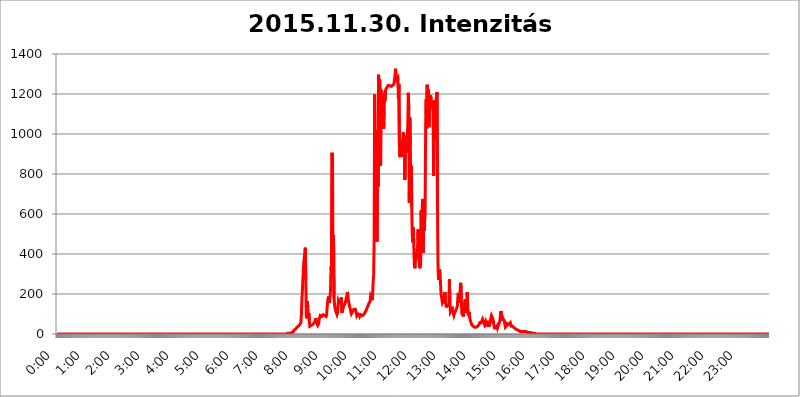
| Category | 2015.11.30. Intenzitás [W/m^2] |
|---|---|
| 0.0 | 0 |
| 0.0006944444444444445 | 0 |
| 0.001388888888888889 | 0 |
| 0.0020833333333333333 | 0 |
| 0.002777777777777778 | 0 |
| 0.003472222222222222 | 0 |
| 0.004166666666666667 | 0 |
| 0.004861111111111111 | 0 |
| 0.005555555555555556 | 0 |
| 0.0062499999999999995 | 0 |
| 0.006944444444444444 | 0 |
| 0.007638888888888889 | 0 |
| 0.008333333333333333 | 0 |
| 0.009027777777777779 | 0 |
| 0.009722222222222222 | 0 |
| 0.010416666666666666 | 0 |
| 0.011111111111111112 | 0 |
| 0.011805555555555555 | 0 |
| 0.012499999999999999 | 0 |
| 0.013194444444444444 | 0 |
| 0.013888888888888888 | 0 |
| 0.014583333333333332 | 0 |
| 0.015277777777777777 | 0 |
| 0.015972222222222224 | 0 |
| 0.016666666666666666 | 0 |
| 0.017361111111111112 | 0 |
| 0.018055555555555557 | 0 |
| 0.01875 | 0 |
| 0.019444444444444445 | 0 |
| 0.02013888888888889 | 0 |
| 0.020833333333333332 | 0 |
| 0.02152777777777778 | 0 |
| 0.022222222222222223 | 0 |
| 0.02291666666666667 | 0 |
| 0.02361111111111111 | 0 |
| 0.024305555555555556 | 0 |
| 0.024999999999999998 | 0 |
| 0.025694444444444447 | 0 |
| 0.02638888888888889 | 0 |
| 0.027083333333333334 | 0 |
| 0.027777777777777776 | 0 |
| 0.02847222222222222 | 0 |
| 0.029166666666666664 | 0 |
| 0.029861111111111113 | 0 |
| 0.030555555555555555 | 0 |
| 0.03125 | 0 |
| 0.03194444444444445 | 0 |
| 0.03263888888888889 | 0 |
| 0.03333333333333333 | 0 |
| 0.034027777777777775 | 0 |
| 0.034722222222222224 | 0 |
| 0.035416666666666666 | 0 |
| 0.036111111111111115 | 0 |
| 0.03680555555555556 | 0 |
| 0.0375 | 0 |
| 0.03819444444444444 | 0 |
| 0.03888888888888889 | 0 |
| 0.03958333333333333 | 0 |
| 0.04027777777777778 | 0 |
| 0.04097222222222222 | 0 |
| 0.041666666666666664 | 0 |
| 0.042361111111111106 | 0 |
| 0.04305555555555556 | 0 |
| 0.043750000000000004 | 0 |
| 0.044444444444444446 | 0 |
| 0.04513888888888889 | 0 |
| 0.04583333333333334 | 0 |
| 0.04652777777777778 | 0 |
| 0.04722222222222222 | 0 |
| 0.04791666666666666 | 0 |
| 0.04861111111111111 | 0 |
| 0.049305555555555554 | 0 |
| 0.049999999999999996 | 0 |
| 0.05069444444444445 | 0 |
| 0.051388888888888894 | 0 |
| 0.052083333333333336 | 0 |
| 0.05277777777777778 | 0 |
| 0.05347222222222222 | 0 |
| 0.05416666666666667 | 0 |
| 0.05486111111111111 | 0 |
| 0.05555555555555555 | 0 |
| 0.05625 | 0 |
| 0.05694444444444444 | 0 |
| 0.057638888888888885 | 0 |
| 0.05833333333333333 | 0 |
| 0.05902777777777778 | 0 |
| 0.059722222222222225 | 0 |
| 0.06041666666666667 | 0 |
| 0.061111111111111116 | 0 |
| 0.06180555555555556 | 0 |
| 0.0625 | 0 |
| 0.06319444444444444 | 0 |
| 0.06388888888888888 | 0 |
| 0.06458333333333334 | 0 |
| 0.06527777777777778 | 0 |
| 0.06597222222222222 | 0 |
| 0.06666666666666667 | 0 |
| 0.06736111111111111 | 0 |
| 0.06805555555555555 | 0 |
| 0.06874999999999999 | 0 |
| 0.06944444444444443 | 0 |
| 0.07013888888888889 | 0 |
| 0.07083333333333333 | 0 |
| 0.07152777777777779 | 0 |
| 0.07222222222222223 | 0 |
| 0.07291666666666667 | 0 |
| 0.07361111111111111 | 0 |
| 0.07430555555555556 | 0 |
| 0.075 | 0 |
| 0.07569444444444444 | 0 |
| 0.0763888888888889 | 0 |
| 0.07708333333333334 | 0 |
| 0.07777777777777778 | 0 |
| 0.07847222222222222 | 0 |
| 0.07916666666666666 | 0 |
| 0.0798611111111111 | 0 |
| 0.08055555555555556 | 0 |
| 0.08125 | 0 |
| 0.08194444444444444 | 0 |
| 0.08263888888888889 | 0 |
| 0.08333333333333333 | 0 |
| 0.08402777777777777 | 0 |
| 0.08472222222222221 | 0 |
| 0.08541666666666665 | 0 |
| 0.08611111111111112 | 0 |
| 0.08680555555555557 | 0 |
| 0.08750000000000001 | 0 |
| 0.08819444444444445 | 0 |
| 0.08888888888888889 | 0 |
| 0.08958333333333333 | 0 |
| 0.09027777777777778 | 0 |
| 0.09097222222222222 | 0 |
| 0.09166666666666667 | 0 |
| 0.09236111111111112 | 0 |
| 0.09305555555555556 | 0 |
| 0.09375 | 0 |
| 0.09444444444444444 | 0 |
| 0.09513888888888888 | 0 |
| 0.09583333333333333 | 0 |
| 0.09652777777777777 | 0 |
| 0.09722222222222222 | 0 |
| 0.09791666666666667 | 0 |
| 0.09861111111111111 | 0 |
| 0.09930555555555555 | 0 |
| 0.09999999999999999 | 0 |
| 0.10069444444444443 | 0 |
| 0.1013888888888889 | 0 |
| 0.10208333333333335 | 0 |
| 0.10277777777777779 | 0 |
| 0.10347222222222223 | 0 |
| 0.10416666666666667 | 0 |
| 0.10486111111111111 | 0 |
| 0.10555555555555556 | 0 |
| 0.10625 | 0 |
| 0.10694444444444444 | 0 |
| 0.1076388888888889 | 0 |
| 0.10833333333333334 | 0 |
| 0.10902777777777778 | 0 |
| 0.10972222222222222 | 0 |
| 0.1111111111111111 | 0 |
| 0.11180555555555556 | 0 |
| 0.11180555555555556 | 0 |
| 0.1125 | 0 |
| 0.11319444444444444 | 0 |
| 0.11388888888888889 | 0 |
| 0.11458333333333333 | 0 |
| 0.11527777777777777 | 0 |
| 0.11597222222222221 | 0 |
| 0.11666666666666665 | 0 |
| 0.1173611111111111 | 0 |
| 0.11805555555555557 | 0 |
| 0.11944444444444445 | 0 |
| 0.12013888888888889 | 0 |
| 0.12083333333333333 | 0 |
| 0.12152777777777778 | 0 |
| 0.12222222222222223 | 0 |
| 0.12291666666666667 | 0 |
| 0.12291666666666667 | 0 |
| 0.12361111111111112 | 0 |
| 0.12430555555555556 | 0 |
| 0.125 | 0 |
| 0.12569444444444444 | 0 |
| 0.12638888888888888 | 0 |
| 0.12708333333333333 | 0 |
| 0.16875 | 0 |
| 0.12847222222222224 | 0 |
| 0.12916666666666668 | 0 |
| 0.12986111111111112 | 0 |
| 0.13055555555555556 | 0 |
| 0.13125 | 0 |
| 0.13194444444444445 | 0 |
| 0.1326388888888889 | 0 |
| 0.13333333333333333 | 0 |
| 0.13402777777777777 | 0 |
| 0.13402777777777777 | 0 |
| 0.13472222222222222 | 0 |
| 0.13541666666666666 | 0 |
| 0.1361111111111111 | 0 |
| 0.13749999999999998 | 0 |
| 0.13819444444444443 | 0 |
| 0.1388888888888889 | 0 |
| 0.13958333333333334 | 0 |
| 0.14027777777777778 | 0 |
| 0.14097222222222222 | 0 |
| 0.14166666666666666 | 0 |
| 0.1423611111111111 | 0 |
| 0.14305555555555557 | 0 |
| 0.14375000000000002 | 0 |
| 0.14444444444444446 | 0 |
| 0.1451388888888889 | 0 |
| 0.1451388888888889 | 0 |
| 0.14652777777777778 | 0 |
| 0.14722222222222223 | 0 |
| 0.14791666666666667 | 0 |
| 0.1486111111111111 | 0 |
| 0.14930555555555555 | 0 |
| 0.15 | 0 |
| 0.15069444444444444 | 0 |
| 0.15138888888888888 | 0 |
| 0.15208333333333332 | 0 |
| 0.15277777777777776 | 0 |
| 0.15347222222222223 | 0 |
| 0.15416666666666667 | 0 |
| 0.15486111111111112 | 0 |
| 0.15555555555555556 | 0 |
| 0.15625 | 0 |
| 0.15694444444444444 | 0 |
| 0.15763888888888888 | 0 |
| 0.15833333333333333 | 0 |
| 0.15902777777777777 | 0 |
| 0.15972222222222224 | 0 |
| 0.16041666666666668 | 0 |
| 0.16111111111111112 | 0 |
| 0.16180555555555556 | 0 |
| 0.1625 | 0 |
| 0.16319444444444445 | 0 |
| 0.1638888888888889 | 0 |
| 0.16458333333333333 | 0 |
| 0.16527777777777777 | 0 |
| 0.16597222222222222 | 0 |
| 0.16666666666666666 | 0 |
| 0.1673611111111111 | 0 |
| 0.16805555555555554 | 0 |
| 0.16874999999999998 | 0 |
| 0.16944444444444443 | 0 |
| 0.17013888888888887 | 0 |
| 0.1708333333333333 | 0 |
| 0.17152777777777775 | 0 |
| 0.17222222222222225 | 0 |
| 0.1729166666666667 | 0 |
| 0.17361111111111113 | 0 |
| 0.17430555555555557 | 0 |
| 0.17500000000000002 | 0 |
| 0.17569444444444446 | 0 |
| 0.1763888888888889 | 0 |
| 0.17708333333333334 | 0 |
| 0.17777777777777778 | 0 |
| 0.17847222222222223 | 0 |
| 0.17916666666666667 | 0 |
| 0.1798611111111111 | 0 |
| 0.18055555555555555 | 0 |
| 0.18125 | 0 |
| 0.18194444444444444 | 0 |
| 0.1826388888888889 | 0 |
| 0.18333333333333335 | 0 |
| 0.1840277777777778 | 0 |
| 0.18472222222222223 | 0 |
| 0.18541666666666667 | 0 |
| 0.18611111111111112 | 0 |
| 0.18680555555555556 | 0 |
| 0.1875 | 0 |
| 0.18819444444444444 | 0 |
| 0.18888888888888888 | 0 |
| 0.18958333333333333 | 0 |
| 0.19027777777777777 | 0 |
| 0.1909722222222222 | 0 |
| 0.19166666666666665 | 0 |
| 0.19236111111111112 | 0 |
| 0.19305555555555554 | 0 |
| 0.19375 | 0 |
| 0.19444444444444445 | 0 |
| 0.1951388888888889 | 0 |
| 0.19583333333333333 | 0 |
| 0.19652777777777777 | 0 |
| 0.19722222222222222 | 0 |
| 0.19791666666666666 | 0 |
| 0.1986111111111111 | 0 |
| 0.19930555555555554 | 0 |
| 0.19999999999999998 | 0 |
| 0.20069444444444443 | 0 |
| 0.20138888888888887 | 0 |
| 0.2020833333333333 | 0 |
| 0.2027777777777778 | 0 |
| 0.2034722222222222 | 0 |
| 0.2041666666666667 | 0 |
| 0.20486111111111113 | 0 |
| 0.20555555555555557 | 0 |
| 0.20625000000000002 | 0 |
| 0.20694444444444446 | 0 |
| 0.2076388888888889 | 0 |
| 0.20833333333333334 | 0 |
| 0.20902777777777778 | 0 |
| 0.20972222222222223 | 0 |
| 0.21041666666666667 | 0 |
| 0.2111111111111111 | 0 |
| 0.21180555555555555 | 0 |
| 0.2125 | 0 |
| 0.21319444444444444 | 0 |
| 0.2138888888888889 | 0 |
| 0.21458333333333335 | 0 |
| 0.2152777777777778 | 0 |
| 0.21597222222222223 | 0 |
| 0.21666666666666667 | 0 |
| 0.21736111111111112 | 0 |
| 0.21805555555555556 | 0 |
| 0.21875 | 0 |
| 0.21944444444444444 | 0 |
| 0.22013888888888888 | 0 |
| 0.22083333333333333 | 0 |
| 0.22152777777777777 | 0 |
| 0.2222222222222222 | 0 |
| 0.22291666666666665 | 0 |
| 0.2236111111111111 | 0 |
| 0.22430555555555556 | 0 |
| 0.225 | 0 |
| 0.22569444444444445 | 0 |
| 0.2263888888888889 | 0 |
| 0.22708333333333333 | 0 |
| 0.22777777777777777 | 0 |
| 0.22847222222222222 | 0 |
| 0.22916666666666666 | 0 |
| 0.2298611111111111 | 0 |
| 0.23055555555555554 | 0 |
| 0.23124999999999998 | 0 |
| 0.23194444444444443 | 0 |
| 0.23263888888888887 | 0 |
| 0.2333333333333333 | 0 |
| 0.2340277777777778 | 0 |
| 0.2347222222222222 | 0 |
| 0.2354166666666667 | 0 |
| 0.23611111111111113 | 0 |
| 0.23680555555555557 | 0 |
| 0.23750000000000002 | 0 |
| 0.23819444444444446 | 0 |
| 0.2388888888888889 | 0 |
| 0.23958333333333334 | 0 |
| 0.24027777777777778 | 0 |
| 0.24097222222222223 | 0 |
| 0.24166666666666667 | 0 |
| 0.2423611111111111 | 0 |
| 0.24305555555555555 | 0 |
| 0.24375 | 0 |
| 0.24444444444444446 | 0 |
| 0.24513888888888888 | 0 |
| 0.24583333333333335 | 0 |
| 0.2465277777777778 | 0 |
| 0.24722222222222223 | 0 |
| 0.24791666666666667 | 0 |
| 0.24861111111111112 | 0 |
| 0.24930555555555556 | 0 |
| 0.25 | 0 |
| 0.25069444444444444 | 0 |
| 0.2513888888888889 | 0 |
| 0.2520833333333333 | 0 |
| 0.25277777777777777 | 0 |
| 0.2534722222222222 | 0 |
| 0.25416666666666665 | 0 |
| 0.2548611111111111 | 0 |
| 0.2555555555555556 | 0 |
| 0.25625000000000003 | 0 |
| 0.2569444444444445 | 0 |
| 0.2576388888888889 | 0 |
| 0.25833333333333336 | 0 |
| 0.2590277777777778 | 0 |
| 0.25972222222222224 | 0 |
| 0.2604166666666667 | 0 |
| 0.2611111111111111 | 0 |
| 0.26180555555555557 | 0 |
| 0.2625 | 0 |
| 0.26319444444444445 | 0 |
| 0.2638888888888889 | 0 |
| 0.26458333333333334 | 0 |
| 0.2652777777777778 | 0 |
| 0.2659722222222222 | 0 |
| 0.26666666666666666 | 0 |
| 0.2673611111111111 | 0 |
| 0.26805555555555555 | 0 |
| 0.26875 | 0 |
| 0.26944444444444443 | 0 |
| 0.2701388888888889 | 0 |
| 0.2708333333333333 | 0 |
| 0.27152777777777776 | 0 |
| 0.2722222222222222 | 0 |
| 0.27291666666666664 | 0 |
| 0.2736111111111111 | 0 |
| 0.2743055555555555 | 0 |
| 0.27499999999999997 | 0 |
| 0.27569444444444446 | 0 |
| 0.27638888888888885 | 0 |
| 0.27708333333333335 | 0 |
| 0.2777777777777778 | 0 |
| 0.27847222222222223 | 0 |
| 0.2791666666666667 | 0 |
| 0.2798611111111111 | 0 |
| 0.28055555555555556 | 0 |
| 0.28125 | 0 |
| 0.28194444444444444 | 0 |
| 0.2826388888888889 | 0 |
| 0.2833333333333333 | 0 |
| 0.28402777777777777 | 0 |
| 0.2847222222222222 | 0 |
| 0.28541666666666665 | 0 |
| 0.28611111111111115 | 0 |
| 0.28680555555555554 | 0 |
| 0.28750000000000003 | 0 |
| 0.2881944444444445 | 0 |
| 0.2888888888888889 | 0 |
| 0.28958333333333336 | 0 |
| 0.2902777777777778 | 0 |
| 0.29097222222222224 | 0 |
| 0.2916666666666667 | 0 |
| 0.2923611111111111 | 0 |
| 0.29305555555555557 | 0 |
| 0.29375 | 0 |
| 0.29444444444444445 | 0 |
| 0.2951388888888889 | 0 |
| 0.29583333333333334 | 0 |
| 0.2965277777777778 | 0 |
| 0.2972222222222222 | 0 |
| 0.29791666666666666 | 0 |
| 0.2986111111111111 | 0 |
| 0.29930555555555555 | 0 |
| 0.3 | 0 |
| 0.30069444444444443 | 0 |
| 0.3013888888888889 | 0 |
| 0.3020833333333333 | 0 |
| 0.30277777777777776 | 0 |
| 0.3034722222222222 | 0 |
| 0.30416666666666664 | 0 |
| 0.3048611111111111 | 0 |
| 0.3055555555555555 | 0 |
| 0.30624999999999997 | 0 |
| 0.3069444444444444 | 0 |
| 0.3076388888888889 | 0 |
| 0.30833333333333335 | 0 |
| 0.3090277777777778 | 0 |
| 0.30972222222222223 | 0 |
| 0.3104166666666667 | 0 |
| 0.3111111111111111 | 0 |
| 0.31180555555555556 | 0 |
| 0.3125 | 0 |
| 0.31319444444444444 | 0 |
| 0.3138888888888889 | 0 |
| 0.3145833333333333 | 0 |
| 0.31527777777777777 | 0 |
| 0.3159722222222222 | 0 |
| 0.31666666666666665 | 0 |
| 0.31736111111111115 | 0 |
| 0.31805555555555554 | 0 |
| 0.31875000000000003 | 0 |
| 0.3194444444444445 | 0 |
| 0.3201388888888889 | 0 |
| 0.32083333333333336 | 0 |
| 0.3215277777777778 | 0 |
| 0.32222222222222224 | 0 |
| 0.3229166666666667 | 3.525 |
| 0.3236111111111111 | 3.525 |
| 0.32430555555555557 | 3.525 |
| 0.325 | 3.525 |
| 0.32569444444444445 | 3.525 |
| 0.3263888888888889 | 3.525 |
| 0.32708333333333334 | 3.525 |
| 0.3277777777777778 | 7.887 |
| 0.3284722222222222 | 7.887 |
| 0.32916666666666666 | 7.887 |
| 0.3298611111111111 | 12.257 |
| 0.33055555555555555 | 12.257 |
| 0.33125 | 12.257 |
| 0.33194444444444443 | 16.636 |
| 0.3326388888888889 | 21.024 |
| 0.3333333333333333 | 21.024 |
| 0.3340277777777778 | 25.419 |
| 0.3347222222222222 | 25.419 |
| 0.3354166666666667 | 29.823 |
| 0.3361111111111111 | 34.234 |
| 0.3368055555555556 | 34.234 |
| 0.33749999999999997 | 38.653 |
| 0.33819444444444446 | 38.653 |
| 0.33888888888888885 | 38.653 |
| 0.33958333333333335 | 43.079 |
| 0.34027777777777773 | 47.511 |
| 0.34097222222222223 | 51.951 |
| 0.3416666666666666 | 56.398 |
| 0.3423611111111111 | 92.184 |
| 0.3430555555555555 | 164.605 |
| 0.34375 | 210.182 |
| 0.3444444444444445 | 269.49 |
| 0.3451388888888889 | 314.98 |
| 0.3458333333333334 | 360.221 |
| 0.34652777777777777 | 360.221 |
| 0.34722222222222227 | 405.108 |
| 0.34791666666666665 | 431.833 |
| 0.34861111111111115 | 269.49 |
| 0.34930555555555554 | 92.184 |
| 0.35000000000000003 | 78.722 |
| 0.3506944444444444 | 164.605 |
| 0.3513888888888889 | 132.814 |
| 0.3520833333333333 | 78.722 |
| 0.3527777777777778 | 105.69 |
| 0.3534722222222222 | 69.775 |
| 0.3541666666666667 | 38.653 |
| 0.3548611111111111 | 38.653 |
| 0.35555555555555557 | 38.653 |
| 0.35625 | 43.079 |
| 0.35694444444444445 | 43.079 |
| 0.3576388888888889 | 47.511 |
| 0.35833333333333334 | 47.511 |
| 0.3590277777777778 | 47.511 |
| 0.3597222222222222 | 51.951 |
| 0.36041666666666666 | 56.398 |
| 0.3611111111111111 | 56.398 |
| 0.36180555555555555 | 65.31 |
| 0.3625 | 78.722 |
| 0.36319444444444443 | 69.775 |
| 0.3638888888888889 | 56.398 |
| 0.3645833333333333 | 51.951 |
| 0.3652777777777778 | 43.079 |
| 0.3659722222222222 | 47.511 |
| 0.3666666666666667 | 51.951 |
| 0.3673611111111111 | 74.246 |
| 0.3680555555555556 | 83.205 |
| 0.36874999999999997 | 92.184 |
| 0.36944444444444446 | 92.184 |
| 0.37013888888888885 | 87.692 |
| 0.37083333333333335 | 87.692 |
| 0.37152777777777773 | 83.205 |
| 0.37222222222222223 | 87.692 |
| 0.3729166666666666 | 96.682 |
| 0.3736111111111111 | 96.682 |
| 0.3743055555555555 | 96.682 |
| 0.375 | 92.184 |
| 0.3756944444444445 | 87.692 |
| 0.3763888888888889 | 87.692 |
| 0.3770833333333334 | 87.692 |
| 0.37777777777777777 | 96.682 |
| 0.37847222222222227 | 128.284 |
| 0.37916666666666665 | 160.056 |
| 0.37986111111111115 | 178.264 |
| 0.38055555555555554 | 187.378 |
| 0.38125000000000003 | 155.509 |
| 0.3819444444444444 | 164.605 |
| 0.3826388888888889 | 187.378 |
| 0.3833333333333333 | 223.873 |
| 0.3840277777777778 | 337.639 |
| 0.3847222222222222 | 314.98 |
| 0.3854166666666667 | 906.223 |
| 0.3861111111111111 | 875.918 |
| 0.38680555555555557 | 319.517 |
| 0.3875 | 493.475 |
| 0.38819444444444445 | 182.82 |
| 0.3888888888888889 | 146.423 |
| 0.38958333333333334 | 128.284 |
| 0.3902777777777778 | 119.235 |
| 0.3909722222222222 | 110.201 |
| 0.39166666666666666 | 105.69 |
| 0.3923611111111111 | 96.682 |
| 0.39305555555555555 | 105.69 |
| 0.39375 | 137.347 |
| 0.39444444444444443 | 169.156 |
| 0.3951388888888889 | 173.709 |
| 0.3958333333333333 | 160.056 |
| 0.3965277777777778 | 146.423 |
| 0.3972222222222222 | 141.884 |
| 0.3979166666666667 | 146.423 |
| 0.3986111111111111 | 182.82 |
| 0.3993055555555556 | 105.69 |
| 0.39999999999999997 | 110.201 |
| 0.40069444444444446 | 128.284 |
| 0.40138888888888885 | 137.347 |
| 0.40208333333333335 | 132.814 |
| 0.40277777777777773 | 137.347 |
| 0.40347222222222223 | 150.964 |
| 0.4041666666666666 | 160.056 |
| 0.4048611111111111 | 155.509 |
| 0.4055555555555555 | 164.605 |
| 0.40625 | 191.937 |
| 0.4069444444444445 | 210.182 |
| 0.4076388888888889 | 191.937 |
| 0.4083333333333334 | 169.156 |
| 0.40902777777777777 | 155.509 |
| 0.40972222222222227 | 141.884 |
| 0.41041666666666665 | 132.814 |
| 0.41111111111111115 | 123.758 |
| 0.41180555555555554 | 110.201 |
| 0.41250000000000003 | 101.184 |
| 0.4131944444444444 | 101.184 |
| 0.4138888888888889 | 110.201 |
| 0.4145833333333333 | 110.201 |
| 0.4152777777777778 | 114.716 |
| 0.4159722222222222 | 123.758 |
| 0.4166666666666667 | 128.284 |
| 0.4173611111111111 | 123.758 |
| 0.41805555555555557 | 123.758 |
| 0.41875 | 119.235 |
| 0.41944444444444445 | 105.69 |
| 0.4201388888888889 | 92.184 |
| 0.42083333333333334 | 96.682 |
| 0.4215277777777778 | 101.184 |
| 0.4222222222222222 | 101.184 |
| 0.42291666666666666 | 101.184 |
| 0.4236111111111111 | 96.682 |
| 0.42430555555555555 | 87.692 |
| 0.425 | 92.184 |
| 0.42569444444444443 | 96.682 |
| 0.4263888888888889 | 101.184 |
| 0.4270833333333333 | 96.682 |
| 0.4277777777777778 | 92.184 |
| 0.4284722222222222 | 92.184 |
| 0.4291666666666667 | 92.184 |
| 0.4298611111111111 | 96.682 |
| 0.4305555555555556 | 101.184 |
| 0.43124999999999997 | 105.69 |
| 0.43194444444444446 | 105.69 |
| 0.43263888888888885 | 110.201 |
| 0.43333333333333335 | 119.235 |
| 0.43402777777777773 | 123.758 |
| 0.43472222222222223 | 132.814 |
| 0.4354166666666666 | 137.347 |
| 0.4361111111111111 | 141.884 |
| 0.4368055555555555 | 150.964 |
| 0.4375 | 150.964 |
| 0.4381944444444445 | 150.964 |
| 0.4388888888888889 | 164.605 |
| 0.4395833333333334 | 191.937 |
| 0.44027777777777777 | 196.497 |
| 0.44097222222222227 | 182.82 |
| 0.44166666666666665 | 169.156 |
| 0.44236111111111115 | 201.058 |
| 0.44305555555555554 | 260.373 |
| 0.44375000000000003 | 296.808 |
| 0.4444444444444444 | 467.187 |
| 0.4451388888888889 | 1197.876 |
| 0.4458333333333333 | 795.074 |
| 0.4465277777777778 | 462.786 |
| 0.4472222222222222 | 634.105 |
| 0.4479166666666667 | 510.885 |
| 0.4486111111111111 | 462.786 |
| 0.44930555555555557 | 1018.587 |
| 0.45 | 735.89 |
| 0.45069444444444445 | 1296.248 |
| 0.4513888888888889 | 936.33 |
| 0.45208333333333334 | 1275.142 |
| 0.4527777777777778 | 1193.918 |
| 0.4534722222222222 | 841.526 |
| 0.45416666666666666 | 1217.812 |
| 0.4548611111111111 | 1213.804 |
| 0.45555555555555555 | 1209.807 |
| 0.45625 | 1213.804 |
| 0.45694444444444443 | 1154.814 |
| 0.4576388888888889 | 1026.06 |
| 0.4583333333333333 | 1052.255 |
| 0.4590277777777778 | 1201.843 |
| 0.4597222222222222 | 1166.46 |
| 0.4604166666666667 | 1217.812 |
| 0.4611111111111111 | 1225.859 |
| 0.4618055555555556 | 1229.899 |
| 0.46249999999999997 | 1233.951 |
| 0.46319444444444446 | 1238.014 |
| 0.46388888888888885 | 1242.089 |
| 0.46458333333333335 | 1242.089 |
| 0.46527777777777773 | 1242.089 |
| 0.46597222222222223 | 1242.089 |
| 0.4666666666666666 | 1242.089 |
| 0.4673611111111111 | 1242.089 |
| 0.4680555555555555 | 1238.014 |
| 0.46875 | 1238.014 |
| 0.4694444444444445 | 1242.089 |
| 0.4701388888888889 | 1242.089 |
| 0.4708333333333334 | 1242.089 |
| 0.47152777777777777 | 1246.176 |
| 0.47222222222222227 | 1250.275 |
| 0.47291666666666665 | 1254.387 |
| 0.47361111111111115 | 1287.761 |
| 0.47430555555555554 | 1326.445 |
| 0.47500000000000003 | 1304.795 |
| 0.4756944444444444 | 1279.334 |
| 0.4763888888888889 | 1270.964 |
| 0.4770833333333333 | 1266.8 |
| 0.4777777777777778 | 1279.334 |
| 0.4784722222222222 | 1174.263 |
| 0.4791666666666667 | 1250.275 |
| 0.4798611111111111 | 947.58 |
| 0.48055555555555557 | 883.516 |
| 0.48125 | 958.814 |
| 0.48194444444444445 | 902.447 |
| 0.4826388888888889 | 921.298 |
| 0.48333333333333334 | 940.082 |
| 0.4840277777777778 | 887.309 |
| 0.4847222222222222 | 973.772 |
| 0.48541666666666666 | 1007.383 |
| 0.4861111111111111 | 970.034 |
| 0.48680555555555555 | 992.448 |
| 0.4875 | 771.559 |
| 0.48819444444444443 | 894.885 |
| 0.4888888888888889 | 958.814 |
| 0.4895833333333333 | 906.223 |
| 0.4902777777777778 | 981.244 |
| 0.4909722222222222 | 966.295 |
| 0.4916666666666667 | 1033.537 |
| 0.4923611111111111 | 1205.82 |
| 0.4930555555555556 | 1127.879 |
| 0.49374999999999997 | 654.791 |
| 0.49444444444444446 | 1082.324 |
| 0.49513888888888885 | 951.327 |
| 0.49583333333333335 | 727.896 |
| 0.49652777777777773 | 841.526 |
| 0.49722222222222223 | 634.105 |
| 0.4979166666666666 | 493.475 |
| 0.4986111111111111 | 458.38 |
| 0.4993055555555555 | 532.513 |
| 0.5 | 458.38 |
| 0.5006944444444444 | 355.712 |
| 0.5013888888888889 | 328.584 |
| 0.5020833333333333 | 342.162 |
| 0.5027777777777778 | 409.574 |
| 0.5034722222222222 | 378.224 |
| 0.5041666666666667 | 405.108 |
| 0.5048611111111111 | 427.39 |
| 0.5055555555555555 | 409.574 |
| 0.50625 | 523.88 |
| 0.5069444444444444 | 387.202 |
| 0.5076388888888889 | 351.198 |
| 0.5083333333333333 | 328.584 |
| 0.5090277777777777 | 328.584 |
| 0.5097222222222222 | 351.198 |
| 0.5104166666666666 | 617.436 |
| 0.5111111111111112 | 431.833 |
| 0.5118055555555555 | 617.436 |
| 0.5125000000000001 | 675.311 |
| 0.5131944444444444 | 405.108 |
| 0.513888888888889 | 541.121 |
| 0.5145833333333333 | 515.223 |
| 0.5152777777777778 | 562.53 |
| 0.5159722222222222 | 604.864 |
| 0.5166666666666667 | 1029.798 |
| 0.517361111111111 | 1174.263 |
| 0.5180555555555556 | 1026.06 |
| 0.5187499999999999 | 1246.176 |
| 0.5194444444444445 | 1225.859 |
| 0.5201388888888888 | 1229.899 |
| 0.5208333333333334 | 1217.812 |
| 0.5215277777777778 | 1033.537 |
| 0.5222222222222223 | 1186.03 |
| 0.5229166666666667 | 1178.177 |
| 0.5236111111111111 | 1193.918 |
| 0.5243055555555556 | 1174.263 |
| 0.525 | 1158.689 |
| 0.5256944444444445 | 1166.46 |
| 0.5263888888888889 | 1131.708 |
| 0.5270833333333333 | 1108.816 |
| 0.5277777777777778 | 791.169 |
| 0.5284722222222222 | 1166.46 |
| 0.5291666666666667 | 1143.232 |
| 0.5298611111111111 | 1166.46 |
| 0.5305555555555556 | 970.034 |
| 0.53125 | 1162.571 |
| 0.5319444444444444 | 1162.571 |
| 0.5326388888888889 | 1209.807 |
| 0.5333333333333333 | 609.062 |
| 0.5340277777777778 | 346.682 |
| 0.5347222222222222 | 269.49 |
| 0.5354166666666667 | 314.98 |
| 0.5361111111111111 | 324.052 |
| 0.5368055555555555 | 305.898 |
| 0.5375 | 260.373 |
| 0.5381944444444444 | 205.62 |
| 0.5388888888888889 | 187.378 |
| 0.5395833333333333 | 191.937 |
| 0.5402777777777777 | 155.509 |
| 0.5409722222222222 | 160.056 |
| 0.5416666666666666 | 155.509 |
| 0.5423611111111112 | 169.156 |
| 0.5430555555555555 | 173.709 |
| 0.5437500000000001 | 210.182 |
| 0.5444444444444444 | 160.056 |
| 0.545138888888889 | 146.423 |
| 0.5458333333333333 | 132.814 |
| 0.5465277777777778 | 141.884 |
| 0.5472222222222222 | 141.884 |
| 0.5479166666666667 | 141.884 |
| 0.548611111111111 | 141.884 |
| 0.5493055555555556 | 155.509 |
| 0.5499999999999999 | 274.047 |
| 0.5506944444444445 | 164.605 |
| 0.5513888888888888 | 110.201 |
| 0.5520833333333334 | 110.201 |
| 0.5527777777777778 | 119.235 |
| 0.5534722222222223 | 137.347 |
| 0.5541666666666667 | 119.235 |
| 0.5548611111111111 | 114.716 |
| 0.5555555555555556 | 101.184 |
| 0.55625 | 92.184 |
| 0.5569444444444445 | 101.184 |
| 0.5576388888888889 | 101.184 |
| 0.5583333333333333 | 101.184 |
| 0.5590277777777778 | 119.235 |
| 0.5597222222222222 | 114.716 |
| 0.5604166666666667 | 119.235 |
| 0.5611111111111111 | 137.347 |
| 0.5618055555555556 | 178.264 |
| 0.5625 | 205.62 |
| 0.5631944444444444 | 155.509 |
| 0.5638888888888889 | 178.264 |
| 0.5645833333333333 | 196.497 |
| 0.5652777777777778 | 228.436 |
| 0.5659722222222222 | 255.813 |
| 0.5666666666666667 | 178.264 |
| 0.5673611111111111 | 114.716 |
| 0.5680555555555555 | 96.682 |
| 0.56875 | 155.509 |
| 0.5694444444444444 | 87.692 |
| 0.5701388888888889 | 114.716 |
| 0.5708333333333333 | 123.758 |
| 0.5715277777777777 | 155.509 |
| 0.5722222222222222 | 173.709 |
| 0.5729166666666666 | 128.284 |
| 0.5736111111111112 | 105.69 |
| 0.5743055555555555 | 150.964 |
| 0.5750000000000001 | 210.182 |
| 0.5756944444444444 | 141.884 |
| 0.576388888888889 | 92.184 |
| 0.5770833333333333 | 87.692 |
| 0.5777777777777778 | 110.201 |
| 0.5784722222222222 | 83.205 |
| 0.5791666666666667 | 69.775 |
| 0.579861111111111 | 60.85 |
| 0.5805555555555556 | 56.398 |
| 0.5812499999999999 | 47.511 |
| 0.5819444444444445 | 47.511 |
| 0.5826388888888888 | 47.511 |
| 0.5833333333333334 | 38.653 |
| 0.5840277777777778 | 38.653 |
| 0.5847222222222223 | 38.653 |
| 0.5854166666666667 | 34.234 |
| 0.5861111111111111 | 34.234 |
| 0.5868055555555556 | 38.653 |
| 0.5875 | 34.234 |
| 0.5881944444444445 | 34.234 |
| 0.5888888888888889 | 38.653 |
| 0.5895833333333333 | 38.653 |
| 0.5902777777777778 | 38.653 |
| 0.5909722222222222 | 43.079 |
| 0.5916666666666667 | 47.511 |
| 0.5923611111111111 | 56.398 |
| 0.5930555555555556 | 51.951 |
| 0.59375 | 60.85 |
| 0.5944444444444444 | 56.398 |
| 0.5951388888888889 | 56.398 |
| 0.5958333333333333 | 56.398 |
| 0.5965277777777778 | 74.246 |
| 0.5972222222222222 | 74.246 |
| 0.5979166666666667 | 60.85 |
| 0.5986111111111111 | 56.398 |
| 0.5993055555555555 | 47.511 |
| 0.6 | 51.951 |
| 0.6006944444444444 | 60.85 |
| 0.6013888888888889 | 47.511 |
| 0.6020833333333333 | 47.511 |
| 0.6027777777777777 | 51.951 |
| 0.6034722222222222 | 56.398 |
| 0.6041666666666666 | 43.079 |
| 0.6048611111111112 | 38.653 |
| 0.6055555555555555 | 43.079 |
| 0.6062500000000001 | 43.079 |
| 0.6069444444444444 | 47.511 |
| 0.607638888888889 | 60.85 |
| 0.6083333333333333 | 83.205 |
| 0.6090277777777778 | 92.184 |
| 0.6097222222222222 | 96.682 |
| 0.6104166666666667 | 87.692 |
| 0.611111111111111 | 74.246 |
| 0.6118055555555556 | 69.775 |
| 0.6124999999999999 | 43.079 |
| 0.6131944444444445 | 29.823 |
| 0.6138888888888888 | 25.419 |
| 0.6145833333333334 | 29.823 |
| 0.6152777777777778 | 29.823 |
| 0.6159722222222223 | 29.823 |
| 0.6166666666666667 | 38.653 |
| 0.6173611111111111 | 29.823 |
| 0.6180555555555556 | 25.419 |
| 0.61875 | 34.234 |
| 0.6194444444444445 | 51.951 |
| 0.6201388888888889 | 56.398 |
| 0.6208333333333333 | 65.31 |
| 0.6215277777777778 | 92.184 |
| 0.6222222222222222 | 114.716 |
| 0.6229166666666667 | 105.69 |
| 0.6236111111111111 | 101.184 |
| 0.6243055555555556 | 78.722 |
| 0.625 | 65.31 |
| 0.6256944444444444 | 74.246 |
| 0.6263888888888889 | 74.246 |
| 0.6270833333333333 | 65.31 |
| 0.6277777777777778 | 47.511 |
| 0.6284722222222222 | 34.234 |
| 0.6291666666666667 | 29.823 |
| 0.6298611111111111 | 29.823 |
| 0.6305555555555555 | 43.079 |
| 0.63125 | 51.951 |
| 0.6319444444444444 | 51.951 |
| 0.6326388888888889 | 56.398 |
| 0.6333333333333333 | 47.511 |
| 0.6340277777777777 | 47.511 |
| 0.6347222222222222 | 51.951 |
| 0.6354166666666666 | 56.398 |
| 0.6361111111111112 | 51.951 |
| 0.6368055555555555 | 38.653 |
| 0.6375000000000001 | 38.653 |
| 0.6381944444444444 | 43.079 |
| 0.638888888888889 | 38.653 |
| 0.6395833333333333 | 38.653 |
| 0.6402777777777778 | 38.653 |
| 0.6409722222222222 | 29.823 |
| 0.6416666666666667 | 25.419 |
| 0.642361111111111 | 25.419 |
| 0.6430555555555556 | 25.419 |
| 0.6437499999999999 | 21.024 |
| 0.6444444444444445 | 21.024 |
| 0.6451388888888888 | 21.024 |
| 0.6458333333333334 | 21.024 |
| 0.6465277777777778 | 16.636 |
| 0.6472222222222223 | 16.636 |
| 0.6479166666666667 | 12.257 |
| 0.6486111111111111 | 12.257 |
| 0.6493055555555556 | 12.257 |
| 0.65 | 12.257 |
| 0.6506944444444445 | 12.257 |
| 0.6513888888888889 | 12.257 |
| 0.6520833333333333 | 12.257 |
| 0.6527777777777778 | 12.257 |
| 0.6534722222222222 | 12.257 |
| 0.6541666666666667 | 12.257 |
| 0.6548611111111111 | 12.257 |
| 0.6555555555555556 | 12.257 |
| 0.65625 | 12.257 |
| 0.6569444444444444 | 12.257 |
| 0.6576388888888889 | 12.257 |
| 0.6583333333333333 | 12.257 |
| 0.6590277777777778 | 7.887 |
| 0.6597222222222222 | 7.887 |
| 0.6604166666666667 | 12.257 |
| 0.6611111111111111 | 7.887 |
| 0.6618055555555555 | 7.887 |
| 0.6625 | 7.887 |
| 0.6631944444444444 | 7.887 |
| 0.6638888888888889 | 7.887 |
| 0.6645833333333333 | 3.525 |
| 0.6652777777777777 | 7.887 |
| 0.6659722222222222 | 3.525 |
| 0.6666666666666666 | 3.525 |
| 0.6673611111111111 | 3.525 |
| 0.6680555555555556 | 3.525 |
| 0.6687500000000001 | 3.525 |
| 0.6694444444444444 | 3.525 |
| 0.6701388888888888 | 3.525 |
| 0.6708333333333334 | 3.525 |
| 0.6715277777777778 | 0 |
| 0.6722222222222222 | 0 |
| 0.6729166666666666 | 0 |
| 0.6736111111111112 | 0 |
| 0.6743055555555556 | 0 |
| 0.6749999999999999 | 0 |
| 0.6756944444444444 | 0 |
| 0.6763888888888889 | 0 |
| 0.6770833333333334 | 0 |
| 0.6777777777777777 | 0 |
| 0.6784722222222223 | 0 |
| 0.6791666666666667 | 0 |
| 0.6798611111111111 | 0 |
| 0.6805555555555555 | 0 |
| 0.68125 | 0 |
| 0.6819444444444445 | 0 |
| 0.6826388888888889 | 0 |
| 0.6833333333333332 | 0 |
| 0.6840277777777778 | 0 |
| 0.6847222222222222 | 0 |
| 0.6854166666666667 | 0 |
| 0.686111111111111 | 0 |
| 0.6868055555555556 | 0 |
| 0.6875 | 0 |
| 0.6881944444444444 | 0 |
| 0.688888888888889 | 0 |
| 0.6895833333333333 | 0 |
| 0.6902777777777778 | 0 |
| 0.6909722222222222 | 0 |
| 0.6916666666666668 | 0 |
| 0.6923611111111111 | 0 |
| 0.6930555555555555 | 0 |
| 0.69375 | 0 |
| 0.6944444444444445 | 0 |
| 0.6951388888888889 | 0 |
| 0.6958333333333333 | 0 |
| 0.6965277777777777 | 0 |
| 0.6972222222222223 | 0 |
| 0.6979166666666666 | 0 |
| 0.6986111111111111 | 0 |
| 0.6993055555555556 | 0 |
| 0.7000000000000001 | 0 |
| 0.7006944444444444 | 0 |
| 0.7013888888888888 | 0 |
| 0.7020833333333334 | 0 |
| 0.7027777777777778 | 0 |
| 0.7034722222222222 | 0 |
| 0.7041666666666666 | 0 |
| 0.7048611111111112 | 0 |
| 0.7055555555555556 | 0 |
| 0.7062499999999999 | 0 |
| 0.7069444444444444 | 0 |
| 0.7076388888888889 | 0 |
| 0.7083333333333334 | 0 |
| 0.7090277777777777 | 0 |
| 0.7097222222222223 | 0 |
| 0.7104166666666667 | 0 |
| 0.7111111111111111 | 0 |
| 0.7118055555555555 | 0 |
| 0.7125 | 0 |
| 0.7131944444444445 | 0 |
| 0.7138888888888889 | 0 |
| 0.7145833333333332 | 0 |
| 0.7152777777777778 | 0 |
| 0.7159722222222222 | 0 |
| 0.7166666666666667 | 0 |
| 0.717361111111111 | 0 |
| 0.7180555555555556 | 0 |
| 0.71875 | 0 |
| 0.7194444444444444 | 0 |
| 0.720138888888889 | 0 |
| 0.7208333333333333 | 0 |
| 0.7215277777777778 | 0 |
| 0.7222222222222222 | 0 |
| 0.7229166666666668 | 0 |
| 0.7236111111111111 | 0 |
| 0.7243055555555555 | 0 |
| 0.725 | 0 |
| 0.7256944444444445 | 0 |
| 0.7263888888888889 | 0 |
| 0.7270833333333333 | 0 |
| 0.7277777777777777 | 0 |
| 0.7284722222222223 | 0 |
| 0.7291666666666666 | 0 |
| 0.7298611111111111 | 0 |
| 0.7305555555555556 | 0 |
| 0.7312500000000001 | 0 |
| 0.7319444444444444 | 0 |
| 0.7326388888888888 | 0 |
| 0.7333333333333334 | 0 |
| 0.7340277777777778 | 0 |
| 0.7347222222222222 | 0 |
| 0.7354166666666666 | 0 |
| 0.7361111111111112 | 0 |
| 0.7368055555555556 | 0 |
| 0.7374999999999999 | 0 |
| 0.7381944444444444 | 0 |
| 0.7388888888888889 | 0 |
| 0.7395833333333334 | 0 |
| 0.7402777777777777 | 0 |
| 0.7409722222222223 | 0 |
| 0.7416666666666667 | 0 |
| 0.7423611111111111 | 0 |
| 0.7430555555555555 | 0 |
| 0.74375 | 0 |
| 0.7444444444444445 | 0 |
| 0.7451388888888889 | 0 |
| 0.7458333333333332 | 0 |
| 0.7465277777777778 | 0 |
| 0.7472222222222222 | 0 |
| 0.7479166666666667 | 0 |
| 0.748611111111111 | 0 |
| 0.7493055555555556 | 0 |
| 0.75 | 0 |
| 0.7506944444444444 | 0 |
| 0.751388888888889 | 0 |
| 0.7520833333333333 | 0 |
| 0.7527777777777778 | 0 |
| 0.7534722222222222 | 0 |
| 0.7541666666666668 | 0 |
| 0.7548611111111111 | 0 |
| 0.7555555555555555 | 0 |
| 0.75625 | 0 |
| 0.7569444444444445 | 0 |
| 0.7576388888888889 | 0 |
| 0.7583333333333333 | 0 |
| 0.7590277777777777 | 0 |
| 0.7597222222222223 | 0 |
| 0.7604166666666666 | 0 |
| 0.7611111111111111 | 0 |
| 0.7618055555555556 | 0 |
| 0.7625000000000001 | 0 |
| 0.7631944444444444 | 0 |
| 0.7638888888888888 | 0 |
| 0.7645833333333334 | 0 |
| 0.7652777777777778 | 0 |
| 0.7659722222222222 | 0 |
| 0.7666666666666666 | 0 |
| 0.7673611111111112 | 0 |
| 0.7680555555555556 | 0 |
| 0.7687499999999999 | 0 |
| 0.7694444444444444 | 0 |
| 0.7701388888888889 | 0 |
| 0.7708333333333334 | 0 |
| 0.7715277777777777 | 0 |
| 0.7722222222222223 | 0 |
| 0.7729166666666667 | 0 |
| 0.7736111111111111 | 0 |
| 0.7743055555555555 | 0 |
| 0.775 | 0 |
| 0.7756944444444445 | 0 |
| 0.7763888888888889 | 0 |
| 0.7770833333333332 | 0 |
| 0.7777777777777778 | 0 |
| 0.7784722222222222 | 0 |
| 0.7791666666666667 | 0 |
| 0.779861111111111 | 0 |
| 0.7805555555555556 | 0 |
| 0.78125 | 0 |
| 0.7819444444444444 | 0 |
| 0.782638888888889 | 0 |
| 0.7833333333333333 | 0 |
| 0.7840277777777778 | 0 |
| 0.7847222222222222 | 0 |
| 0.7854166666666668 | 0 |
| 0.7861111111111111 | 0 |
| 0.7868055555555555 | 0 |
| 0.7875 | 0 |
| 0.7881944444444445 | 0 |
| 0.7888888888888889 | 0 |
| 0.7895833333333333 | 0 |
| 0.7902777777777777 | 0 |
| 0.7909722222222223 | 0 |
| 0.7916666666666666 | 0 |
| 0.7923611111111111 | 0 |
| 0.7930555555555556 | 0 |
| 0.7937500000000001 | 0 |
| 0.7944444444444444 | 0 |
| 0.7951388888888888 | 0 |
| 0.7958333333333334 | 0 |
| 0.7965277777777778 | 0 |
| 0.7972222222222222 | 0 |
| 0.7979166666666666 | 0 |
| 0.7986111111111112 | 0 |
| 0.7993055555555556 | 0 |
| 0.7999999999999999 | 0 |
| 0.8006944444444444 | 0 |
| 0.8013888888888889 | 0 |
| 0.8020833333333334 | 0 |
| 0.8027777777777777 | 0 |
| 0.8034722222222223 | 0 |
| 0.8041666666666667 | 0 |
| 0.8048611111111111 | 0 |
| 0.8055555555555555 | 0 |
| 0.80625 | 0 |
| 0.8069444444444445 | 0 |
| 0.8076388888888889 | 0 |
| 0.8083333333333332 | 0 |
| 0.8090277777777778 | 0 |
| 0.8097222222222222 | 0 |
| 0.8104166666666667 | 0 |
| 0.811111111111111 | 0 |
| 0.8118055555555556 | 0 |
| 0.8125 | 0 |
| 0.8131944444444444 | 0 |
| 0.813888888888889 | 0 |
| 0.8145833333333333 | 0 |
| 0.8152777777777778 | 0 |
| 0.8159722222222222 | 0 |
| 0.8166666666666668 | 0 |
| 0.8173611111111111 | 0 |
| 0.8180555555555555 | 0 |
| 0.81875 | 0 |
| 0.8194444444444445 | 0 |
| 0.8201388888888889 | 0 |
| 0.8208333333333333 | 0 |
| 0.8215277777777777 | 0 |
| 0.8222222222222223 | 0 |
| 0.8229166666666666 | 0 |
| 0.8236111111111111 | 0 |
| 0.8243055555555556 | 0 |
| 0.8250000000000001 | 0 |
| 0.8256944444444444 | 0 |
| 0.8263888888888888 | 0 |
| 0.8270833333333334 | 0 |
| 0.8277777777777778 | 0 |
| 0.8284722222222222 | 0 |
| 0.8291666666666666 | 0 |
| 0.8298611111111112 | 0 |
| 0.8305555555555556 | 0 |
| 0.8312499999999999 | 0 |
| 0.8319444444444444 | 0 |
| 0.8326388888888889 | 0 |
| 0.8333333333333334 | 0 |
| 0.8340277777777777 | 0 |
| 0.8347222222222223 | 0 |
| 0.8354166666666667 | 0 |
| 0.8361111111111111 | 0 |
| 0.8368055555555555 | 0 |
| 0.8375 | 0 |
| 0.8381944444444445 | 0 |
| 0.8388888888888889 | 0 |
| 0.8395833333333332 | 0 |
| 0.8402777777777778 | 0 |
| 0.8409722222222222 | 0 |
| 0.8416666666666667 | 0 |
| 0.842361111111111 | 0 |
| 0.8430555555555556 | 0 |
| 0.84375 | 0 |
| 0.8444444444444444 | 0 |
| 0.845138888888889 | 0 |
| 0.8458333333333333 | 0 |
| 0.8465277777777778 | 0 |
| 0.8472222222222222 | 0 |
| 0.8479166666666668 | 0 |
| 0.8486111111111111 | 0 |
| 0.8493055555555555 | 0 |
| 0.85 | 0 |
| 0.8506944444444445 | 0 |
| 0.8513888888888889 | 0 |
| 0.8520833333333333 | 0 |
| 0.8527777777777777 | 0 |
| 0.8534722222222223 | 0 |
| 0.8541666666666666 | 0 |
| 0.8548611111111111 | 0 |
| 0.8555555555555556 | 0 |
| 0.8562500000000001 | 0 |
| 0.8569444444444444 | 0 |
| 0.8576388888888888 | 0 |
| 0.8583333333333334 | 0 |
| 0.8590277777777778 | 0 |
| 0.8597222222222222 | 0 |
| 0.8604166666666666 | 0 |
| 0.8611111111111112 | 0 |
| 0.8618055555555556 | 0 |
| 0.8624999999999999 | 0 |
| 0.8631944444444444 | 0 |
| 0.8638888888888889 | 0 |
| 0.8645833333333334 | 0 |
| 0.8652777777777777 | 0 |
| 0.8659722222222223 | 0 |
| 0.8666666666666667 | 0 |
| 0.8673611111111111 | 0 |
| 0.8680555555555555 | 0 |
| 0.86875 | 0 |
| 0.8694444444444445 | 0 |
| 0.8701388888888889 | 0 |
| 0.8708333333333332 | 0 |
| 0.8715277777777778 | 0 |
| 0.8722222222222222 | 0 |
| 0.8729166666666667 | 0 |
| 0.873611111111111 | 0 |
| 0.8743055555555556 | 0 |
| 0.875 | 0 |
| 0.8756944444444444 | 0 |
| 0.876388888888889 | 0 |
| 0.8770833333333333 | 0 |
| 0.8777777777777778 | 0 |
| 0.8784722222222222 | 0 |
| 0.8791666666666668 | 0 |
| 0.8798611111111111 | 0 |
| 0.8805555555555555 | 0 |
| 0.88125 | 0 |
| 0.8819444444444445 | 0 |
| 0.8826388888888889 | 0 |
| 0.8833333333333333 | 0 |
| 0.8840277777777777 | 0 |
| 0.8847222222222223 | 0 |
| 0.8854166666666666 | 0 |
| 0.8861111111111111 | 0 |
| 0.8868055555555556 | 0 |
| 0.8875000000000001 | 0 |
| 0.8881944444444444 | 0 |
| 0.8888888888888888 | 0 |
| 0.8895833333333334 | 0 |
| 0.8902777777777778 | 0 |
| 0.8909722222222222 | 0 |
| 0.8916666666666666 | 0 |
| 0.8923611111111112 | 0 |
| 0.8930555555555556 | 0 |
| 0.8937499999999999 | 0 |
| 0.8944444444444444 | 0 |
| 0.8951388888888889 | 0 |
| 0.8958333333333334 | 0 |
| 0.8965277777777777 | 0 |
| 0.8972222222222223 | 0 |
| 0.8979166666666667 | 0 |
| 0.8986111111111111 | 0 |
| 0.8993055555555555 | 0 |
| 0.9 | 0 |
| 0.9006944444444445 | 0 |
| 0.9013888888888889 | 0 |
| 0.9020833333333332 | 0 |
| 0.9027777777777778 | 0 |
| 0.9034722222222222 | 0 |
| 0.9041666666666667 | 0 |
| 0.904861111111111 | 0 |
| 0.9055555555555556 | 0 |
| 0.90625 | 0 |
| 0.9069444444444444 | 0 |
| 0.907638888888889 | 0 |
| 0.9083333333333333 | 0 |
| 0.9090277777777778 | 0 |
| 0.9097222222222222 | 0 |
| 0.9104166666666668 | 0 |
| 0.9111111111111111 | 0 |
| 0.9118055555555555 | 0 |
| 0.9125 | 0 |
| 0.9131944444444445 | 0 |
| 0.9138888888888889 | 0 |
| 0.9145833333333333 | 0 |
| 0.9152777777777777 | 0 |
| 0.9159722222222223 | 0 |
| 0.9166666666666666 | 0 |
| 0.9173611111111111 | 0 |
| 0.9180555555555556 | 0 |
| 0.9187500000000001 | 0 |
| 0.9194444444444444 | 0 |
| 0.9201388888888888 | 0 |
| 0.9208333333333334 | 0 |
| 0.9215277777777778 | 0 |
| 0.9222222222222222 | 0 |
| 0.9229166666666666 | 0 |
| 0.9236111111111112 | 0 |
| 0.9243055555555556 | 0 |
| 0.9249999999999999 | 0 |
| 0.9256944444444444 | 0 |
| 0.9263888888888889 | 0 |
| 0.9270833333333334 | 0 |
| 0.9277777777777777 | 0 |
| 0.9284722222222223 | 0 |
| 0.9291666666666667 | 0 |
| 0.9298611111111111 | 0 |
| 0.9305555555555555 | 0 |
| 0.93125 | 0 |
| 0.9319444444444445 | 0 |
| 0.9326388888888889 | 0 |
| 0.9333333333333332 | 0 |
| 0.9340277777777778 | 0 |
| 0.9347222222222222 | 0 |
| 0.9354166666666667 | 0 |
| 0.936111111111111 | 0 |
| 0.9368055555555556 | 0 |
| 0.9375 | 0 |
| 0.9381944444444444 | 0 |
| 0.938888888888889 | 0 |
| 0.9395833333333333 | 0 |
| 0.9402777777777778 | 0 |
| 0.9409722222222222 | 0 |
| 0.9416666666666668 | 0 |
| 0.9423611111111111 | 0 |
| 0.9430555555555555 | 0 |
| 0.94375 | 0 |
| 0.9444444444444445 | 0 |
| 0.9451388888888889 | 0 |
| 0.9458333333333333 | 0 |
| 0.9465277777777777 | 0 |
| 0.9472222222222223 | 0 |
| 0.9479166666666666 | 0 |
| 0.9486111111111111 | 0 |
| 0.9493055555555556 | 0 |
| 0.9500000000000001 | 0 |
| 0.9506944444444444 | 0 |
| 0.9513888888888888 | 0 |
| 0.9520833333333334 | 0 |
| 0.9527777777777778 | 0 |
| 0.9534722222222222 | 0 |
| 0.9541666666666666 | 0 |
| 0.9548611111111112 | 0 |
| 0.9555555555555556 | 0 |
| 0.9562499999999999 | 0 |
| 0.9569444444444444 | 0 |
| 0.9576388888888889 | 0 |
| 0.9583333333333334 | 0 |
| 0.9590277777777777 | 0 |
| 0.9597222222222223 | 0 |
| 0.9604166666666667 | 0 |
| 0.9611111111111111 | 0 |
| 0.9618055555555555 | 0 |
| 0.9625 | 0 |
| 0.9631944444444445 | 0 |
| 0.9638888888888889 | 0 |
| 0.9645833333333332 | 0 |
| 0.9652777777777778 | 0 |
| 0.9659722222222222 | 0 |
| 0.9666666666666667 | 0 |
| 0.967361111111111 | 0 |
| 0.9680555555555556 | 0 |
| 0.96875 | 0 |
| 0.9694444444444444 | 0 |
| 0.970138888888889 | 0 |
| 0.9708333333333333 | 0 |
| 0.9715277777777778 | 0 |
| 0.9722222222222222 | 0 |
| 0.9729166666666668 | 0 |
| 0.9736111111111111 | 0 |
| 0.9743055555555555 | 0 |
| 0.975 | 0 |
| 0.9756944444444445 | 0 |
| 0.9763888888888889 | 0 |
| 0.9770833333333333 | 0 |
| 0.9777777777777777 | 0 |
| 0.9784722222222223 | 0 |
| 0.9791666666666666 | 0 |
| 0.9798611111111111 | 0 |
| 0.9805555555555556 | 0 |
| 0.9812500000000001 | 0 |
| 0.9819444444444444 | 0 |
| 0.9826388888888888 | 0 |
| 0.9833333333333334 | 0 |
| 0.9840277777777778 | 0 |
| 0.9847222222222222 | 0 |
| 0.9854166666666666 | 0 |
| 0.9861111111111112 | 0 |
| 0.9868055555555556 | 0 |
| 0.9874999999999999 | 0 |
| 0.9881944444444444 | 0 |
| 0.9888888888888889 | 0 |
| 0.9895833333333334 | 0 |
| 0.9902777777777777 | 0 |
| 0.9909722222222223 | 0 |
| 0.9916666666666667 | 0 |
| 0.9923611111111111 | 0 |
| 0.9930555555555555 | 0 |
| 0.99375 | 0 |
| 0.9944444444444445 | 0 |
| 0.9951388888888889 | 0 |
| 0.9958333333333332 | 0 |
| 0.9965277777777778 | 0 |
| 0.9972222222222222 | 0 |
| 0.9979166666666667 | 0 |
| 0.998611111111111 | 0 |
| 0.9993055555555556 | 0 |